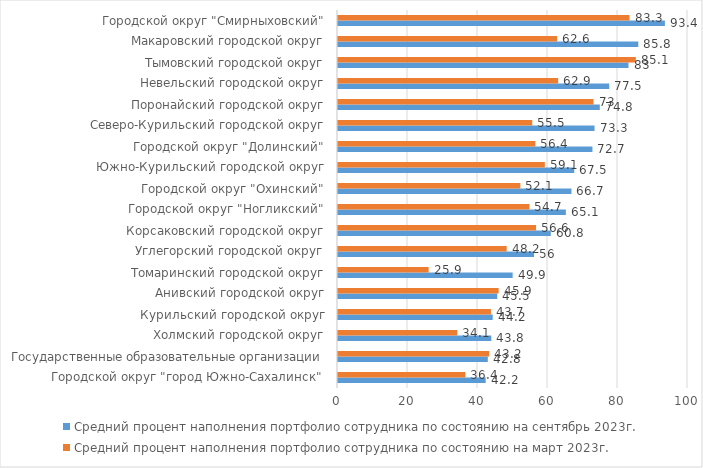
| Category | Средний процент наполнения портфолио сотрудника по состоянию на сентябрь 2023г. | Средний процент наполнения портфолио сотрудника по состоянию на март 2023г. |
|---|---|---|
| Городской округ "город Южно-Сахалинск" | 42.2 | 36.4 |
| Государственные образовательные организации | 42.8 | 43.2 |
| Холмский городской округ | 43.8 | 34.1 |
| Курильский городской округ | 44.2 | 43.7 |
| Анивский городской округ | 45.5 | 45.9 |
| Томаринский городской округ | 49.9 | 25.9 |
| Углегорский городской округ | 56 | 48.2 |
| Корсаковский городской округ | 60.8 | 56.6 |
| Городской округ "Ногликский" | 65.1 | 54.7 |
| Городской округ "Охинский" | 66.7 | 52.1 |
| Южно-Курильский городской округ | 67.5 | 59.1 |
| Городской округ "Долинский" | 72.7 | 56.4 |
| Северо-Курильский городской округ | 73.3 | 55.5 |
| Поронайский городской округ | 74.8 | 73 |
| Невельский городской округ | 77.5 | 62.9 |
| Тымовский городской округ | 83 | 85.1 |
| Макаровский городской округ | 85.8 | 62.6 |
| Городской округ "Смирныховский" | 93.4 | 83.3 |